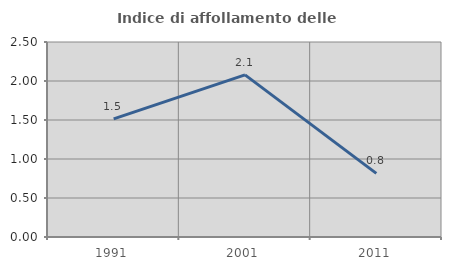
| Category | Indice di affollamento delle abitazioni  |
|---|---|
| 1991.0 | 1.515 |
| 2001.0 | 2.079 |
| 2011.0 | 0.816 |